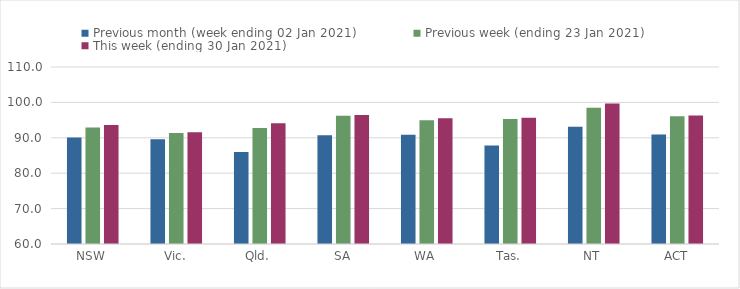
| Category | Previous month (week ending 02 Jan 2021) | Previous week (ending 23 Jan 2021) | This week (ending 30 Jan 2021) |
|---|---|---|---|
| NSW | 90.11 | 92.88 | 93.59 |
| Vic. | 89.58 | 91.37 | 91.58 |
| Qld. | 85.99 | 92.8 | 94.1 |
| SA | 90.74 | 96.23 | 96.42 |
| WA | 90.89 | 94.99 | 95.52 |
| Tas. | 87.86 | 95.31 | 95.67 |
| NT | 93.1 | 98.52 | 99.68 |
| ACT | 90.94 | 96.09 | 96.3 |